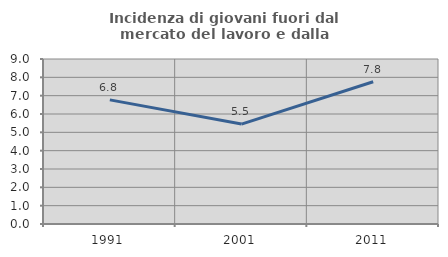
| Category | Incidenza di giovani fuori dal mercato del lavoro e dalla formazione  |
|---|---|
| 1991.0 | 6.771 |
| 2001.0 | 5.45 |
| 2011.0 | 7.758 |